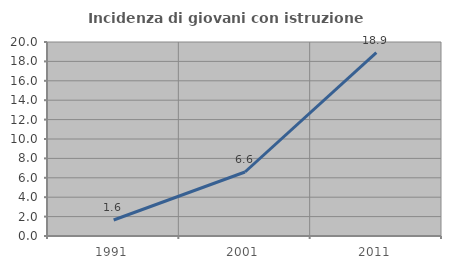
| Category | Incidenza di giovani con istruzione universitaria |
|---|---|
| 1991.0 | 1.648 |
| 2001.0 | 6.599 |
| 2011.0 | 18.905 |